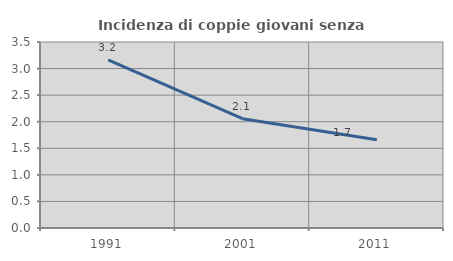
| Category | Incidenza di coppie giovani senza figli |
|---|---|
| 1991.0 | 3.165 |
| 2001.0 | 2.057 |
| 2011.0 | 1.662 |